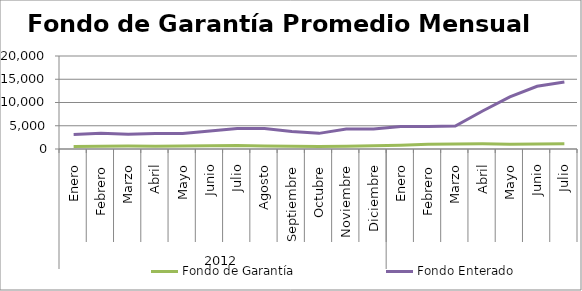
| Category | Fondo de Garantía | Fondo Enterado |
|---|---|---|
| 0 | 560.173 | 3141.641 |
| 1 | 575.916 | 3362.648 |
| 2 | 622.075 | 3154.118 |
| 3 | 612.299 | 3348.058 |
| 4 | 654.277 | 3308.859 |
| 5 | 675.965 | 3850.375 |
| 6 | 729.97 | 4400.539 |
| 7 | 649.095 | 4383.327 |
| 8 | 606.03 | 3757.632 |
| 9 | 525.314 | 3362.932 |
| 10 | 591.646 | 4285.609 |
| 11 | 703.403 | 4296.87 |
| 12 | 823.344 | 4842.786 |
| 13 | 1008.855 | 4845.136 |
| 14 | 1091.101 | 4938.365 |
| 15 | 1128.09 | 8179.666 |
| 16 | 1047.818 | 11202.213 |
| 17 | 1079.154 | 13493.433 |
| 18 | 1130.244 | 14387.844 |